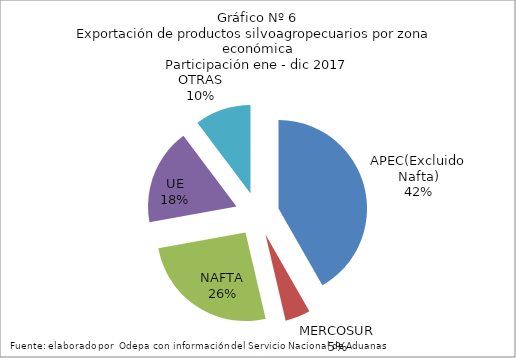
| Category | Series 0 |
|---|---|
| APEC(Excluido Nafta) | 6553429.345 |
| MERCOSUR | 720211.439 |
| NAFTA | 4054772.262 |
| UE | 2760257.76 |
| OTRAS | 1608125.194 |